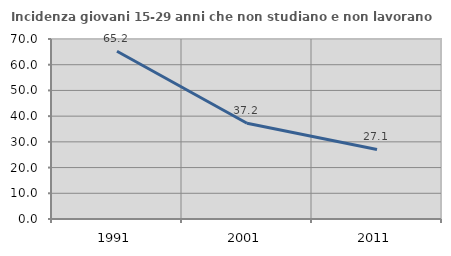
| Category | Incidenza giovani 15-29 anni che non studiano e non lavorano  |
|---|---|
| 1991.0 | 65.22 |
| 2001.0 | 37.239 |
| 2011.0 | 27.063 |